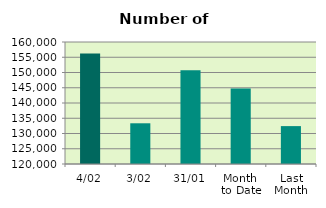
| Category | Series 0 |
|---|---|
| 4/02 | 156198 |
| 3/02 | 133348 |
| 31/01 | 150716 |
| Month 
to Date | 144773 |
| Last
Month | 132423.636 |